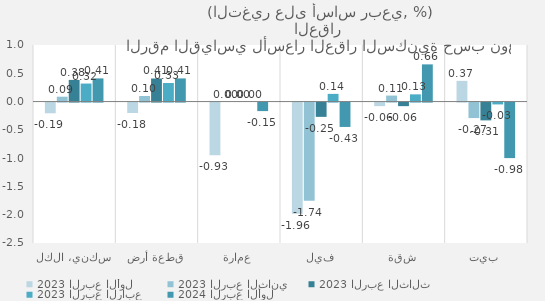
| Category | 2023 | 2024 |
|---|---|---|
| سكني، الكل | 0.319 | 0.41 |
| قطعة أرض | 0.328 | 0.41 |
| عمارة | 0 | -0.151 |
| فيلا | 0.136 | -0.431 |
| شقة | 0.128 | 0.658 |
| بيت | -0.033 | -0.981 |